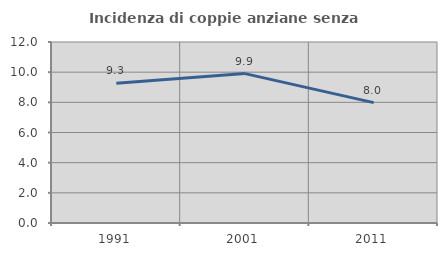
| Category | Incidenza di coppie anziane senza figli  |
|---|---|
| 1991.0 | 9.266 |
| 2001.0 | 9.904 |
| 2011.0 | 7.98 |